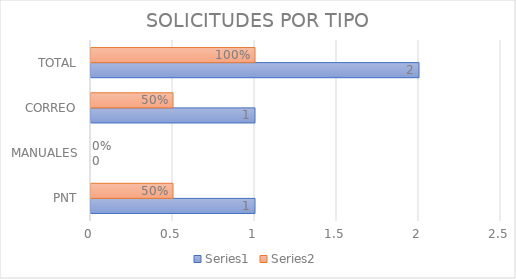
| Category | Series 0 | Series 1 |
|---|---|---|
| PNT | 1 | 0.5 |
| MANUALES | 0 | 0 |
| CORREO | 1 | 0.5 |
| TOTAL | 2 | 1 |